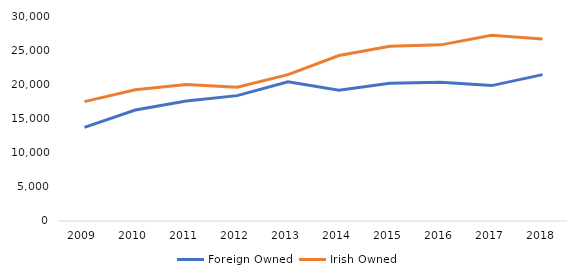
| Category | Foreign Owned | Irish Owned |
|---|---|---|
| 2009.0 | 13706 | 17467 |
| 2010.0 | 16246 | 19202 |
| 2011.0 | 17549 | 19978 |
| 2012.0 | 18348 | 19587 |
| 2013.0 | 20386 | 21425 |
| 2014.0 | 19141 | 24221 |
| 2015.0 | 20151 | 25571 |
| 2016.0 | 20311 | 25776 |
| 2017.0 | 19814 | 27186 |
| 2018.0 | 21416 | 26633 |